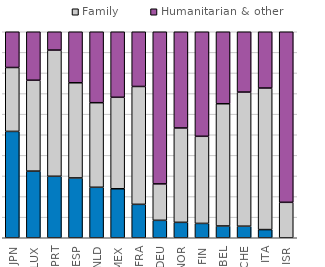
| Category | Workers | Family | Humanitarian & other |
|---|---|---|---|
| JPN | 51.63 | 31.02 | 17.35 |
| LUX | 32.353 | 44.118 | 23.529 |
| PRT | 29.843 | 61.257 | 8.901 |
| ESP | 29.032 | 46.202 | 24.766 |
| NLD | 24.503 | 41.06 | 34.437 |
| MEX | 23.782 | 44.413 | 31.805 |
| FRA | 16.221 | 57.209 | 26.57 |
| DEU | 8.459 | 17.688 | 73.853 |
| NOR | 7.485 | 45.808 | 46.707 |
| FIN | 6.965 | 42.289 | 50.746 |
| BEL | 5.714 | 59.341 | 34.945 |
| CHE | 5.607 | 65.109 | 29.283 |
| ITA | 3.96 | 68.725 | 27.315 |
| ISR | 0 | 17.197 | 82.803 |